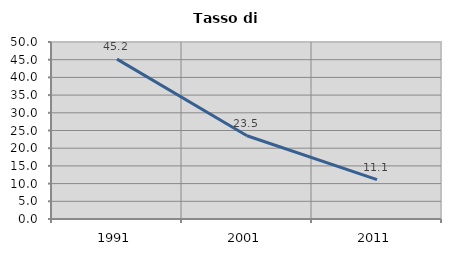
| Category | Tasso di disoccupazione   |
|---|---|
| 1991.0 | 45.161 |
| 2001.0 | 23.505 |
| 2011.0 | 11.134 |